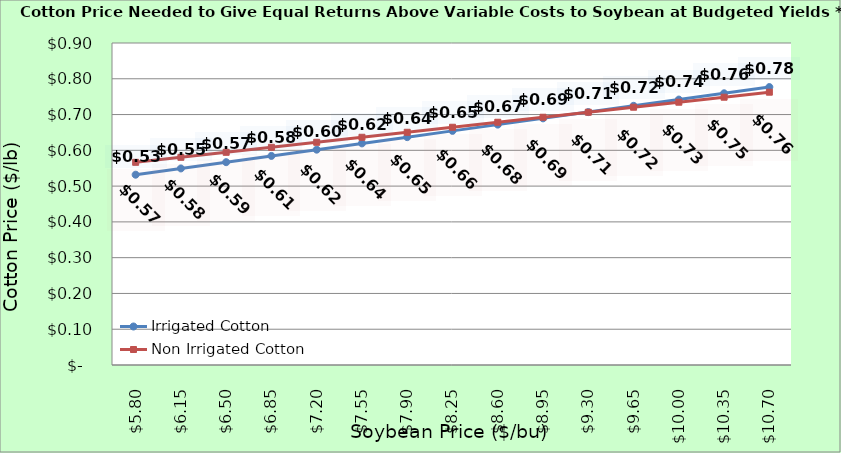
| Category | Irrigated Cotton | Non Irrigated Cotton |
|---|---|---|
| 5.8000000000000025 | 0.532 | 0.566 |
| 6.150000000000002 | 0.549 | 0.58 |
| 6.500000000000002 | 0.567 | 0.594 |
| 6.850000000000001 | 0.584 | 0.608 |
| 7.200000000000001 | 0.602 | 0.622 |
| 7.550000000000001 | 0.619 | 0.636 |
| 7.9 | 0.637 | 0.65 |
| 8.25 | 0.654 | 0.664 |
| 8.6 | 0.672 | 0.678 |
| 8.95 | 0.689 | 0.692 |
| 9.299999999999999 | 0.707 | 0.706 |
| 9.649999999999999 | 0.724 | 0.72 |
| 9.999999999999998 | 0.742 | 0.734 |
| 10.349999999999998 | 0.759 | 0.748 |
| 10.699999999999998 | 0.777 | 0.762 |